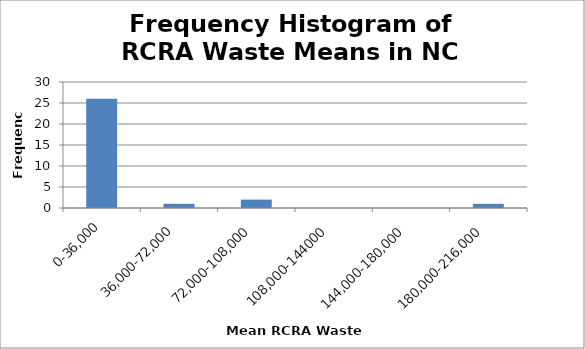
| Category | Series 0 |
|---|---|
| 0-36,000 | 26 |
| 36,000-72,000 | 1 |
| 72,000-108,000 | 2 |
| 108,000-144000 | 0 |
| 144,000-180,000 | 0 |
| 180,000-216,000 | 1 |